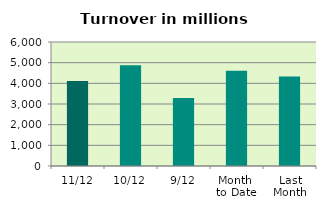
| Category | Series 0 |
|---|---|
| 11/12 | 4111.186 |
| 10/12 | 4873.401 |
| 9/12 | 3288.976 |
| Month 
to Date | 4614.328 |
| Last
Month | 4332.538 |